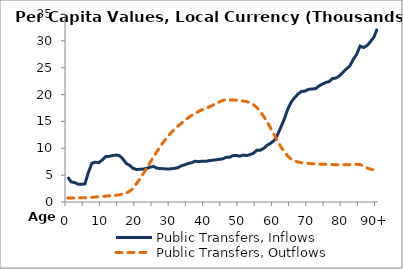
| Category | Public Transfers, Inflows | Public Transfers, Outflows |
|---|---|---|
| 0 | 4648.78 | 757.877 |
|  | 3735.905 | 731.247 |
| 2 | 3624.246 | 725.308 |
| 3 | 3310.864 | 772.513 |
| 4 | 3297.938 | 777.895 |
| 5 | 3372.545 | 797.605 |
| 6 | 5490.934 | 833.018 |
| 7 | 7200.544 | 871.627 |
| 8 | 7412.842 | 922.947 |
| 9 | 7311.32 | 996.307 |
| 10 | 7814.173 | 1043.783 |
| 11 | 8455.789 | 1092.797 |
| 12 | 8486.98 | 1144.453 |
| 13 | 8638.49 | 1203.289 |
| 14 | 8740.332 | 1264.695 |
| 15 | 8654.438 | 1344.236 |
| 16 | 8043.571 | 1452.22 |
| 17 | 7183.726 | 1647.662 |
| 18 | 6838.481 | 1996.057 |
| 19 | 6272.403 | 2541.913 |
| 20 | 6056.32 | 3433.01 |
| 21 | 6090.658 | 4307.669 |
| 22 | 6133.939 | 5300.228 |
| 23 | 6269.295 | 6374.781 |
| 24 | 6492.813 | 7407.238 |
| 25 | 6617.257 | 8431.121 |
| 26 | 6274.774 | 9439.621 |
| 27 | 6237.485 | 10387.682 |
| 28 | 6191.997 | 11297.097 |
| 29 | 6134.395 | 12134.327 |
| 30 | 6194.301 | 12868.584 |
| 31 | 6260.619 | 13530.12 |
| 32 | 6376.214 | 14107.9 |
| 33 | 6730.772 | 14634.744 |
| 34 | 6923.411 | 15142.549 |
| 35 | 7170.365 | 15662.575 |
| 36 | 7309.612 | 16098.593 |
| 37 | 7587.361 | 16467.392 |
| 38 | 7513.03 | 16846.028 |
| 39 | 7592.287 | 17165.883 |
| 40 | 7568.393 | 17373.871 |
| 41 | 7679.52 | 17666.972 |
| 42 | 7760.574 | 17955.382 |
| 43 | 7851.61 | 18303.428 |
| 44 | 7941.221 | 18605.116 |
| 45 | 8008.334 | 18905.31 |
| 46 | 8318.732 | 19031.678 |
| 47 | 8315.794 | 19003.354 |
| 48 | 8632.434 | 18987.169 |
| 49 | 8670.695 | 18963.127 |
| 50 | 8530.877 | 18886.819 |
| 51 | 8732.253 | 18818.311 |
| 52 | 8638.575 | 18701.588 |
| 53 | 8811.948 | 18499.402 |
| 54 | 9075.648 | 18099.898 |
| 55 | 9655.602 | 17586.575 |
| 56 | 9654.76 | 16785.055 |
| 57 | 10000.913 | 15930.716 |
| 58 | 10564.107 | 14871.334 |
| 59 | 10945.201 | 13732.263 |
| 60 | 11444.231 | 12565.644 |
| 61 | 12520.834 | 11364.017 |
| 62 | 13987.289 | 10230.63 |
| 63 | 15489.044 | 9322.79 |
| 64 | 17342.278 | 8536.719 |
| 65 | 18624.434 | 7978.044 |
| 66 | 19451.008 | 7636.599 |
| 67 | 20125.476 | 7434.135 |
| 68 | 20595.251 | 7314.369 |
| 69 | 20655.009 | 7241.469 |
| 70 | 20965.312 | 7181.37 |
| 71 | 21055.539 | 7134.547 |
| 72 | 21071.269 | 7090.426 |
| 73 | 21570.88 | 7058.805 |
| 74 | 21945.963 | 7029.788 |
| 75 | 22251.282 | 7004.524 |
| 76 | 22421.087 | 6987.784 |
| 77 | 22978.204 | 6958.065 |
| 78 | 23072.509 | 6952.996 |
| 79 | 23491.571 | 6931.335 |
| 80 | 24124.879 | 6924.268 |
| 81 | 24748.635 | 6935.421 |
| 82 | 25327.819 | 6957.357 |
| 83 | 26521.775 | 6987.772 |
| 84 | 27491.984 | 7022.805 |
| 85 | 29026.753 | 6985.251 |
| 86 | 28746.881 | 6650.919 |
| 87 | 29109.118 | 6353.337 |
| 88 | 29834.437 | 6100.455 |
| 89 | 30682.355 | 5983.747 |
| 90+ | 32251.591 | 5873.865 |